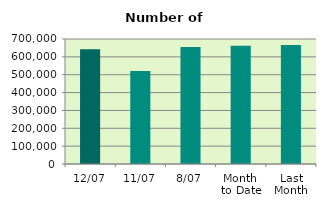
| Category | Series 0 |
|---|---|
| 12/07 | 642020 |
| 11/07 | 520630 |
| 8/07 | 654576 |
| Month 
to Date | 662583 |
| Last
Month | 666251.273 |